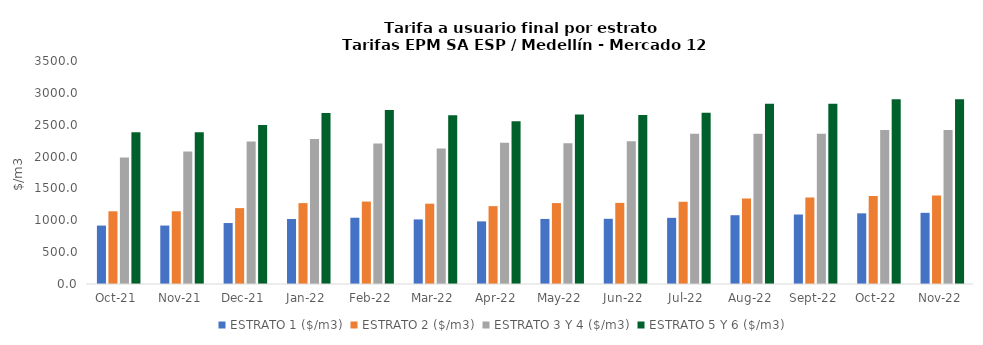
| Category | ESTRATO 1 ($/m3) | ESTRATO 2 ($/m3) | ESTRATO 3 Y 4 ($/m3) | ESTRATO 5 Y 6 ($/m3) |
|---|---|---|---|---|
| 2021-10-01 | 917.11 | 1141.45 | 1985.19 | 2382.228 |
| 2021-11-01 | 917.34 | 1141.04 | 2080.16 | 2382.228 |
| 2021-12-01 | 956.83 | 1190.98 | 2235.75 | 2496.192 |
| 2022-01-01 | 1019.7 | 1269.4 | 2276.07 | 2682.9 |
| 2022-02-01 | 1039.99 | 1293.91 | 2206.46 | 2731.284 |
| 2022-03-01 | 1013.84 | 1260.57 | 2127.67 | 2647.752 |
| 2022-04-01 | 982.96 | 1222.1 | 2218.47 | 2553.204 |
| 2022-05-01 | 1021.15 | 1269.88 | 2210.16 | 2662.164 |
| 2022-06-01 | 1023.53 | 1273.16 | 2240.82 | 2652.192 |
| 2022-07-01 | 1038.48 | 1290.79 | 2358.44 | 2688.984 |
| 2022-08-01 | 1079.67 | 1343.67 | 2358.44 | 2830.128 |
| 2022-09-01 | 1090.78 | 1357.5 | 2358.44 | 2830.128 |
| 2022-10-01 | 1109.09 | 1379.51 | 2416.46 | 2899.752 |
| 2022-11-01 | 1117.11 | 1389.55 | 2416.46 | 2899.752 |